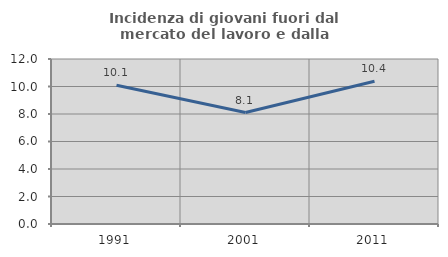
| Category | Incidenza di giovani fuori dal mercato del lavoro e dalla formazione  |
|---|---|
| 1991.0 | 10.09 |
| 2001.0 | 8.105 |
| 2011.0 | 10.388 |